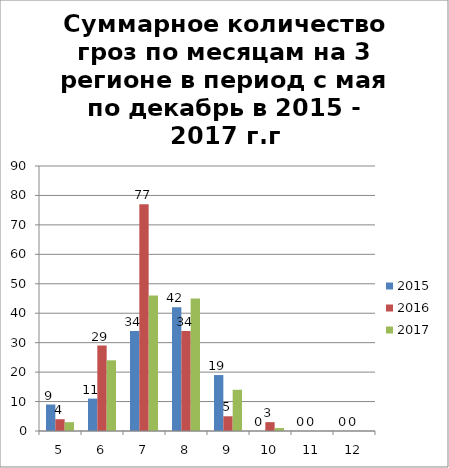
| Category | 2015 | 2016 | 2017 |
|---|---|---|---|
| 5.0 | 9 | 4 | 3 |
| 6.0 | 11 | 29 | 24 |
| 7.0 | 34 | 77 | 46 |
| 8.0 | 42 | 34 | 45 |
| 9.0 | 19 | 5 | 14 |
| 10.0 | 0 | 3 | 1 |
| 11.0 | 0 | 0 | 0 |
| 12.0 | 0 | 0 | 0 |